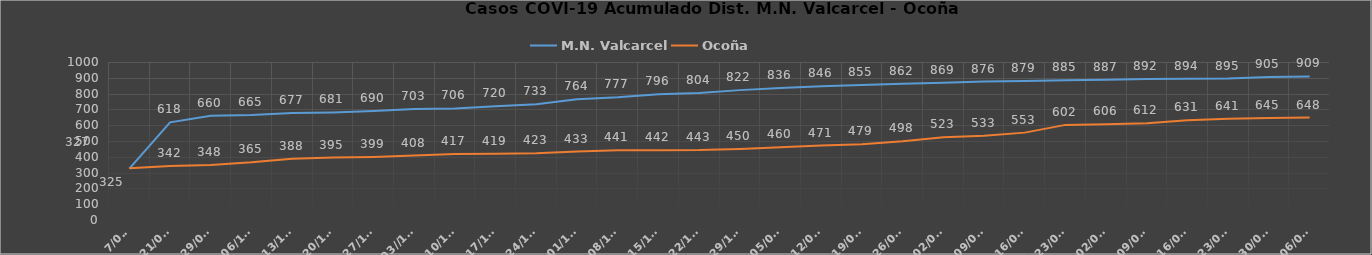
| Category | M.N. Valcarcel | Ocoña |
|---|---|---|
| 7/09/ | 325 | 327 |
| 21/09/ | 618 | 342 |
| 29/09/ | 660 | 348 |
| 06/10/ | 665 | 365 |
| 13/10/ | 677 | 388 |
| 20/10/ | 681 | 395 |
| 27/10/ | 690 | 399 |
| 03//11/ | 703 | 408 |
| 10/11/ | 706 | 417 |
| 17/11/ | 720 | 419 |
| 24/11/ | 733 | 423 |
| 01/12/ | 764 | 433 |
| 08/12/ | 777 | 441 |
| 15/12/ | 796 | 442 |
| 22/12/ | 804 | 443 |
| 29/12/ | 822 | 450 |
| 05/01/ | 836 | 460 |
| 12/01/ | 846 | 471 |
| 19/01/ | 855 | 479 |
| 26/01/ | 862 | 498 |
| 02/02/ | 869 | 523 |
| 09/02/ | 876 | 533 |
| 16/02/ | 879 | 553 |
| 23/02/ | 885 | 602 |
| 02/03/ | 887 | 606 |
| 09/03/ | 892 | 612 |
| 16/03/ | 894 | 631 |
| 23/03/ | 895 | 641 |
| 30/03/ | 905 | 645 |
| 06/04/ | 909 | 648 |